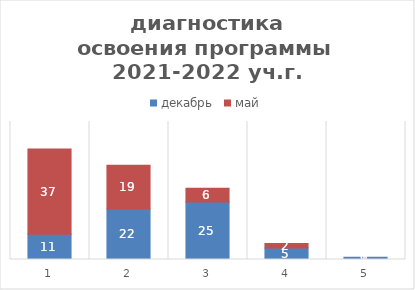
| Category | декабрь | май |
|---|---|---|
| 0 | 11 | 37 |
| 1 | 22 | 19 |
| 2 | 25 | 6 |
| 3 | 5 | 2 |
| 4 | 1 | 0 |